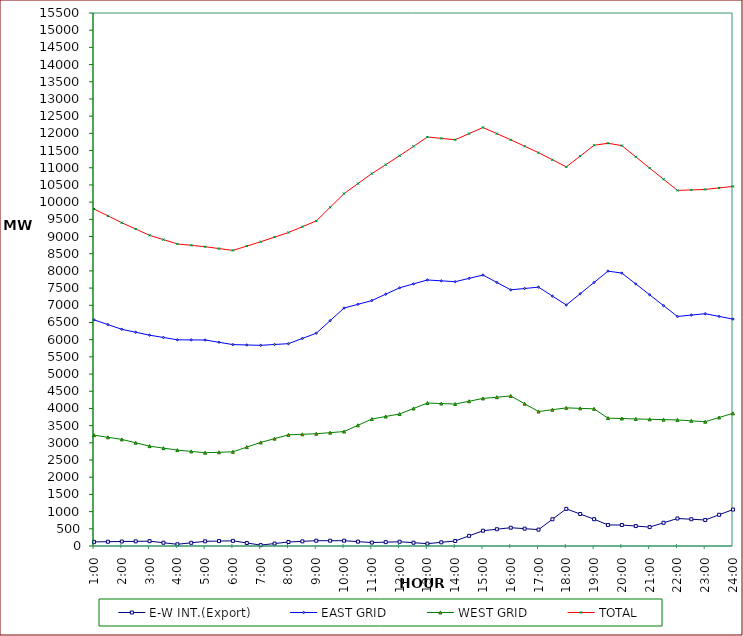
| Category | E-W INT.(Export) | EAST GRID | WEST GRID | TOTAL |
|---|---|---|---|---|
| 1:00 | 120 | 6578 | 3223 | 9801 |
| 1:30 | 125 | 6439.5 | 3161.5 | 9601 |
| 2:00 | 130 | 6301 | 3100 | 9401 |
| 2:30 | 135 | 6216 | 3002 | 9218 |
| 3:00 | 140 | 6131 | 2904 | 9035 |
| 3:30 | 95 | 6063.5 | 2846.5 | 8910 |
| 4:00 | 50 | 5996 | 2789 | 8785 |
| 4:30 | 93 | 5993.5 | 2750.5 | 8744 |
| 5:00 | 136 | 5991 | 2712 | 8703 |
| 5:30 | 143 | 5924 | 2725.5 | 8649.5 |
| 6:00 | 150 | 5857 | 2739 | 8596 |
| 6:30 | 88 | 5846.5 | 2875.5 | 8722 |
| 7:00 | 26 | 5836 | 3012 | 8848 |
| 7:30 | 71 | 5860 | 3122.5 | 8982.5 |
| 8:00 | 116 | 5884 | 3233 | 9117 |
| 8:30 | 135 | 6036 | 3248.5 | 9284.5 |
| 9:00 | 154 | 6188 | 3264 | 9452 |
| 9:30 | 154 | 6553.5 | 3296 | 9849.5 |
| 10:00 | 154 | 6919 | 3328 | 10247 |
| 10:30 | 127 | 7028 | 3510 | 10538 |
| 11:00 | 100 | 7137 | 3692 | 10829 |
| 11:30 | 112 | 7323 | 3766 | 11089 |
| 12:00 | 124 | 7509 | 3840 | 11349 |
| 12:30 | 96 | 7622.5 | 3999 | 11621.5 |
| 13:00 | 68 | 7736 | 4158 | 11894 |
| 13:30 | 107 | 7711 | 4143 | 11854 |
| 14:00 | 146 | 7686 | 4128 | 11814 |
| 14:30 | 295 | 7783 | 4209.5 | 11992.5 |
| 15:00 | 444 | 7880 | 4291 | 12171 |
| 15:30 | 488 | 7664.5 | 4327.5 | 11992 |
| 16:00 | 532 | 7449 | 4364 | 11813 |
| 16:30 | 504 | 7488.5 | 4137 | 11625.5 |
| 17:00 | 476 | 7528 | 3910 | 11438 |
| 17:30 | 778 | 7268 | 3963.5 | 11231.5 |
| 18:00 | 1080 | 7008 | 4017 | 11025 |
| 18:30 | 930 | 7336 | 4003 | 11339 |
| 19:00 | 780 | 7664 | 3989 | 11653 |
| 19:30 | 612 | 7994 | 3718 | 11712 |
| 20:00 | 610 | 7936 | 3707 | 11643 |
| 20:30 | 580 | 7621 | 3695.5 | 11316.5 |
| 21:00 | 550 | 7306 | 3684 | 10990 |
| 21:30 | 675 | 6990.5 | 3675 | 10665.5 |
| 22:00 | 800 | 6675 | 3666 | 10341 |
| 22:30 | 778 | 6715 | 3640 | 10355 |
| 23:00 | 756 | 6755 | 3614 | 10369 |
| 23:30 | 908 | 6676.5 | 3736.5 | 10413 |
| 24:00 | 1060 | 6598 | 3859 | 10457 |